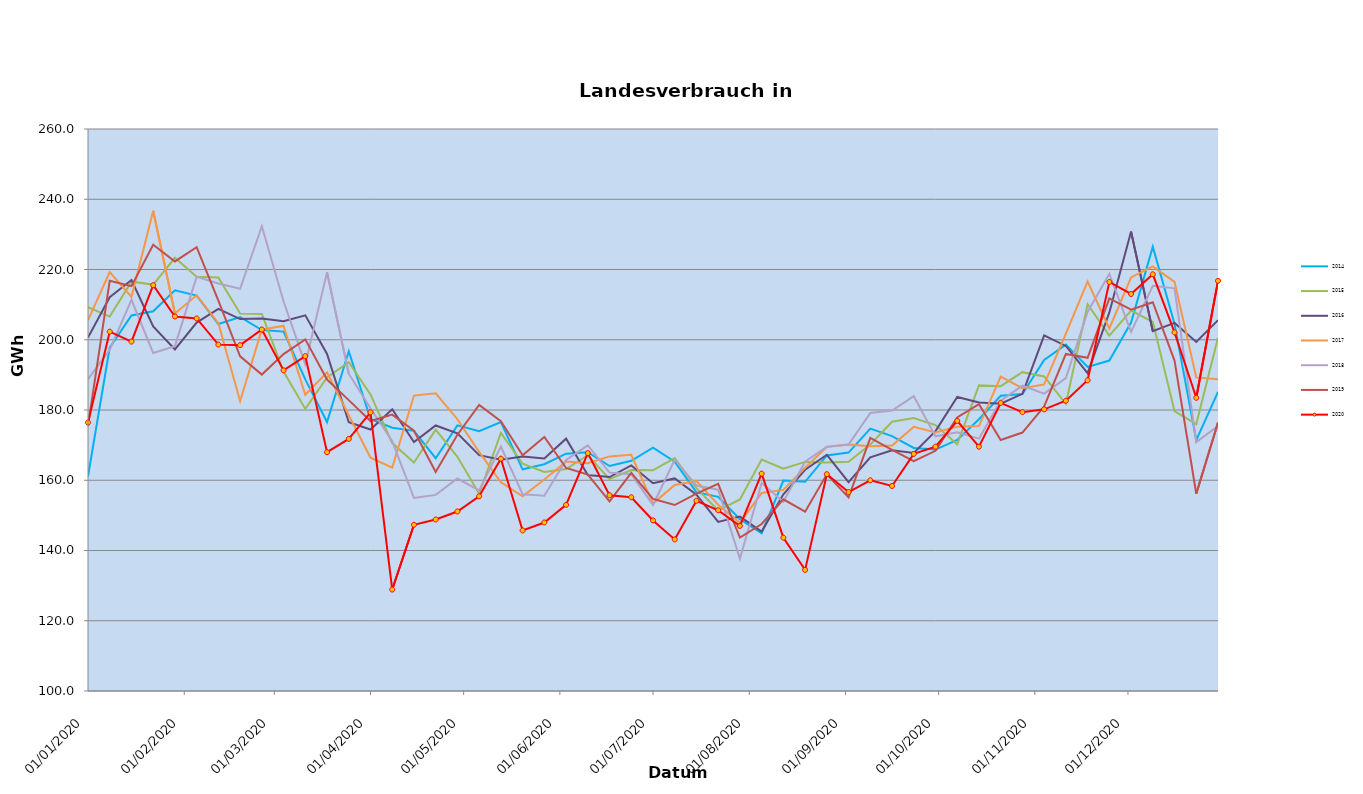
| Category | 2014 | 2015 | 2016 | 2017 | 2018 | 2019 | 2020 |
|---|---|---|---|---|---|---|---|
| 01/01/2020 | 161.121 | 209.312 | 200.6 | 205.577 | 188.778 | 175.427 | 176.434 |
| 08/01/2020 | 197.766 | 206.598 | 212.113 | 219.281 | 197.122 | 216.769 | 202.298 |
| 15/01/2020 | 206.93 | 216.544 | 217.011 | 212.186 | 211.347 | 215.242 | 199.472 |
| 22/01/2020 | 208.101 | 215.708 | 203.763 | 236.748 | 196.241 | 227.044 | 215.528 |
| 29/01/2020 | 214.085 | 223.345 | 197.226 | 207.477 | 198.186 | 222.292 | 206.627 |
| 05/02/2020 | 212.576 | 217.963 | 204.883 | 212.645 | 217.947 | 226.345 | 206.067 |
| 12/02/2020 | 204.489 | 217.743 | 208.809 | 204.695 | 215.994 | 211.151 | 198.625 |
| 19/02/2020 | 206.482 | 207.459 | 205.898 | 182.507 | 214.529 | 195.293 | 198.461 |
| 26/02/2020 | 202.756 | 207.344 | 206.067 | 202.922 | 232.331 | 190.087 | 202.903 |
| 04/03/2020 | 202.321 | 190.926 | 205.254 | 203.945 | 210.897 | 195.923 | 191.281 |
| 11/03/2020 | 188.703 | 180.309 | 206.944 | 184.347 | 193.057 | 200.114 | 195.338 |
| 18/03/2020 | 176.586 | 189.274 | 195.944 | 190.714 | 219.218 | 188.658 | 167.989 |
| 25/03/2020 | 196.732 | 193.612 | 176.5 | 178.508 | 190.331 | 182.809 | 171.783 |
| 01/04/2020 | 177.426 | 184.433 | 174.436 | 166.435 | 180.478 | 176.858 | 179.333 |
| 08/04/2020 | 174.964 | 170.571 | 180.217 | 163.584 | 171.095 | 178.697 | 128.884 |
| 15/04/2020 | 174.069 | 165.073 | 170.895 | 184.108 | 154.948 | 174.092 | 147.321 |
| 22/04/2020 | 166.277 | 174.381 | 175.592 | 184.763 | 155.831 | 162.352 | 148.827 |
| 29/04/2020 | 175.632 | 166.678 | 173.35 | 177.372 | 160.486 | 172.953 | 151.106 |
| 06/05/2020 | 173.988 | 156.168 | 167.158 | 168.058 | 157.129 | 181.453 | 155.433 |
| 13/05/2020 | 176.559 | 173.494 | 165.86 | 159.397 | 169.569 | 176.814 | 166.147 |
| 20/05/2020 | 163.118 | 164.702 | 166.761 | 155.425 | 156.034 | 167.112 | 145.705 |
| 27/05/2020 | 164.572 | 162.332 | 166.168 | 160.237 | 155.597 | 172.33 | 147.972 |
| 03/06/2020 | 167.577 | 163.193 | 171.836 | 165.302 | 165.768 | 163.5 | 152.992 |
| 10/06/2020 | 167.971 | 167.128 | 161.506 | 164.87 | 169.906 | 161.599 | 167.732 |
| 17/06/2020 | 164.048 | 160.312 | 160.91 | 166.789 | 162.18 | 154.014 | 155.739 |
| 24/06/2020 | 165.542 | 162.927 | 164.206 | 167.24 | 161.728 | 162.117 | 155.156 |
| 01/07/2020 | 169.292 | 162.845 | 159.16 | 153.349 | 152.968 | 154.669 | 148.567 |
| 08/07/2020 | 165.269 | 166.314 | 160.518 | 158.638 | 165.843 | 152.945 | 143.148 |
| 15/07/2020 | 156.568 | 157.734 | 155.91 | 159.784 | 158.513 | 156.199 | 154.156 |
| 22/07/2020 | 155.282 | 151.4 | 148.13 | 153.027 | 157.323 | 158.952 | 151.449 |
| 29/07/2020 | 148.902 | 154.543 | 149.662 | 147.886 | 137.622 | 143.664 | 147.005 |
| 05/08/2020 | 144.91 | 165.91 | 145.379 | 156.358 | 159.226 | 147.536 | 161.882 |
| 12/08/2020 | 159.912 | 163.263 | 155.983 | 157.259 | 153.894 | 154.571 | 143.646 |
| 19/08/2020 | 159.548 | 165.222 | 162.975 | 163.579 | 165.279 | 151.065 | 134.481 |
| 26/08/2020 | 167.053 | 165.03 | 167.251 | 169.509 | 169.554 | 161.679 | 161.727 |
| 02/09/2020 | 167.874 | 165.265 | 159.458 | 170.179 | 170.15 | 155.121 | 156.638 |
| 09/09/2020 | 174.703 | 170.168 | 166.501 | 169.711 | 179.13 | 172.069 | 159.986 |
| 16/09/2020 | 172.582 | 176.66 | 168.535 | 169.882 | 179.844 | 168.658 | 158.38 |
| 23/09/2020 | 169.201 | 177.712 | 167.744 | 175.19 | 183.907 | 165.422 | 167.494 |
| 30/09/2020 | 168.727 | 175.725 | 173.998 | 173.616 | 172.496 | 168.389 | 169.557 |
| 07/10/2020 | 171.483 | 170.261 | 183.724 | 175.263 | 173.669 | 177.883 | 176.896 |
| 14/10/2020 | 177.372 | 187.007 | 182.119 | 175.428 | 171.839 | 181.655 | 169.561 |
| 21/10/2020 | 184.053 | 186.797 | 181.797 | 189.498 | 182.67 | 171.442 | 182.007 |
| 28/10/2020 | 184.557 | 190.77 | 184.606 | 186.209 | 186.922 | 173.575 | 179.396 |
| 04/11/2020 | 194.247 | 189.55 | 201.254 | 187.295 | 184.665 | 181.015 | 180.19 |
| 11/11/2020 | 198.623 | 181.768 | 198.236 | 201.718 | 189.079 | 195.973 | 182.632 |
| 18/11/2020 | 192.274 | 210.11 | 190.475 | 216.59 | 207.895 | 194.86 | 188.447 |
| 25/11/2020 | 194.072 | 201.193 | 207.781 | 203.219 | 218.794 | 211.75 | 216.455 |
| 02/12/2020 | 204.89 | 208.299 | 230.791 | 217.762 | 202.247 | 208.577 | 213.026 |
| 09/12/2020 | 226.515 | 205.096 | 202.437 | 220.891 | 215.34 | 210.685 | 218.633 |
| 16/12/2020 | 204.502 | 179.683 | 204.802 | 216.487 | 214.643 | 194.071 | 202.089 |
| 23/12/2020 | 171.405 | 175.987 | 199.368 | 189.274 | 170.866 | 156.165 | 183.475 |
| 30/12/2020 | 185.166 | 200.6 | 205.577 | 188.778 | 175.427 | 176.434 | 216.766 |